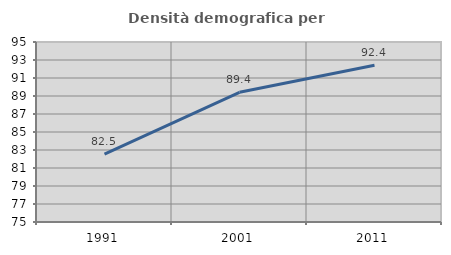
| Category | Densità demografica |
|---|---|
| 1991.0 | 82.545 |
| 2001.0 | 89.41 |
| 2011.0 | 92.424 |